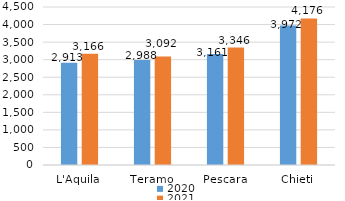
| Category | 2020 | 2021 |
|---|---|---|
| L'Aquila | 2913 | 3166 |
| Teramo | 2988 | 3092 |
| Pescara | 3161 | 3346 |
| Chieti | 3972 | 4176 |